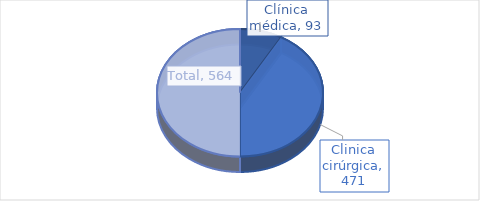
| Category | Series 0 |
|---|---|
| Clínica médica | 93 |
| Clinica cirúrgica | 471 |
| Total | 564 |